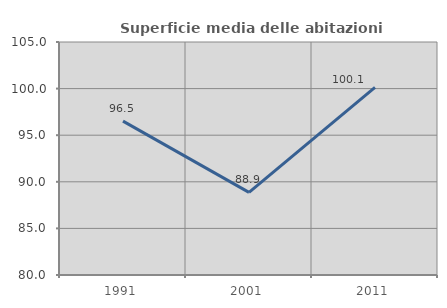
| Category | Superficie media delle abitazioni occupate |
|---|---|
| 1991.0 | 96.507 |
| 2001.0 | 88.864 |
| 2011.0 | 100.136 |